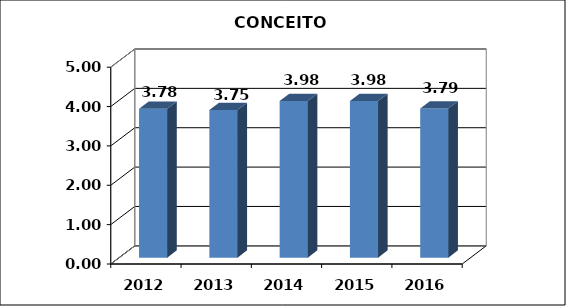
| Category | Series 0 |
|---|---|
| 2012.0 | 3.78 |
| 2013.0 | 3.75 |
| 2014.0 | 3.977 |
| 2015.0 | 3.978 |
| 2016.0 | 3.788 |